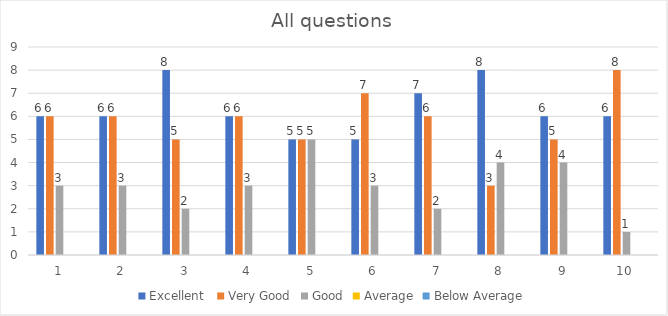
| Category | Excellent  | Very Good | Good | Average | Below Average |
|---|---|---|---|---|---|
| 0 | 6 | 6 | 3 | 0 | 0 |
| 1 | 6 | 6 | 3 | 0 | 0 |
| 2 | 8 | 5 | 2 | 0 | 0 |
| 3 | 6 | 6 | 3 | 0 | 0 |
| 4 | 5 | 5 | 5 | 0 | 0 |
| 5 | 5 | 7 | 3 | 0 | 0 |
| 6 | 7 | 6 | 2 | 0 | 0 |
| 7 | 8 | 3 | 4 | 0 | 0 |
| 8 | 6 | 5 | 4 | 0 | 0 |
| 9 | 6 | 8 | 1 | 0 | 0 |